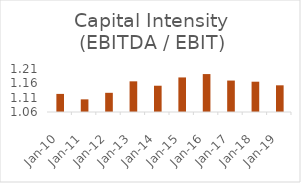
| Category | Capital Intensity (EBITDA / EBIT) |
|---|---|
| 2010-03-31 | 1.123 |
| 2011-03-31 | 1.104 |
| 2012-03-31 | 1.127 |
| 2013-03-31 | 1.167 |
| 2014-03-31 | 1.152 |
| 2015-03-31 | 1.181 |
| 2016-03-31 | 1.192 |
| 2017-03-31 | 1.17 |
| 2018-03-31 | 1.166 |
| 2019-03-31 | 1.153 |